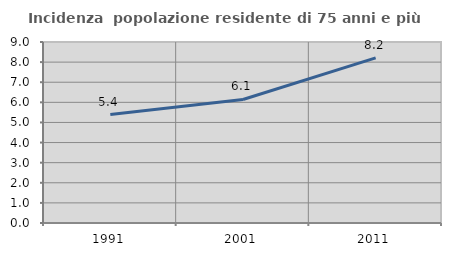
| Category | Incidenza  popolazione residente di 75 anni e più |
|---|---|
| 1991.0 | 5.394 |
| 2001.0 | 6.143 |
| 2011.0 | 8.212 |